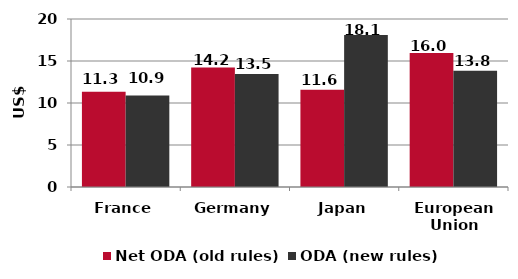
| Category | Net ODA (old rules) | ODA (new rules) |
|---|---|---|
| France | 11338.67 | 10893.736 |
| Germany | 14228.26 | 13458.735 |
| Japan | 11581.65 | 18102.011 |
| European Union | 15959.27 | 13831.735 |